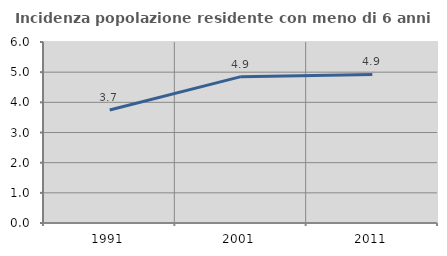
| Category | Incidenza popolazione residente con meno di 6 anni |
|---|---|
| 1991.0 | 3.746 |
| 2001.0 | 4.852 |
| 2011.0 | 4.923 |